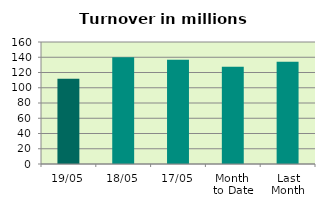
| Category | Series 0 |
|---|---|
| 19/05 | 111.684 |
| 18/05 | 140.075 |
| 17/05 | 136.557 |
| Month 
to Date | 127.592 |
| Last
Month | 133.981 |